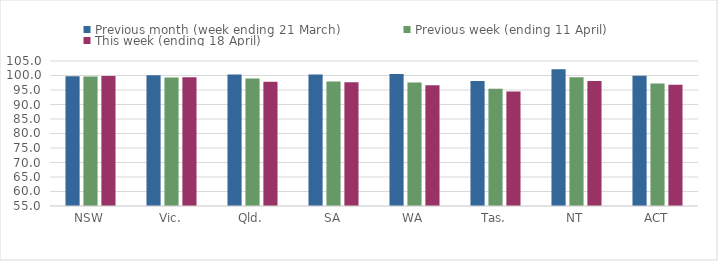
| Category | Previous month (week ending 21 March) | Previous week (ending 11 April) | This week (ending 18 April) |
|---|---|---|---|
| NSW | 99.735 | 99.661 | 99.818 |
| Vic. | 100.081 | 99.351 | 99.368 |
| Qld. | 100.331 | 98.997 | 97.831 |
| SA | 100.377 | 97.894 | 97.681 |
| WA | 100.539 | 97.592 | 96.655 |
| Tas. | 98.128 | 95.42 | 94.456 |
| NT | 102.178 | 99.406 | 98.113 |
| ACT | 99.876 | 97.277 | 96.831 |